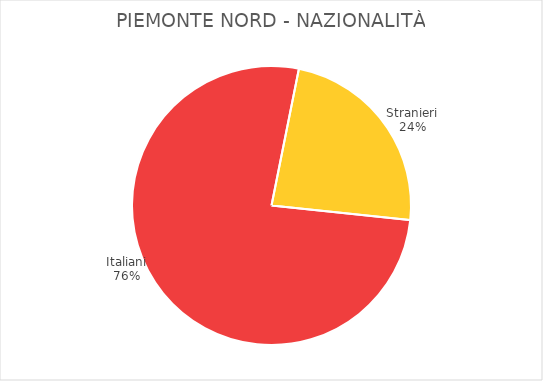
| Category | Piemonte Nord |
|---|---|
| Italiani | 10650 |
| Stranieri | 3275 |